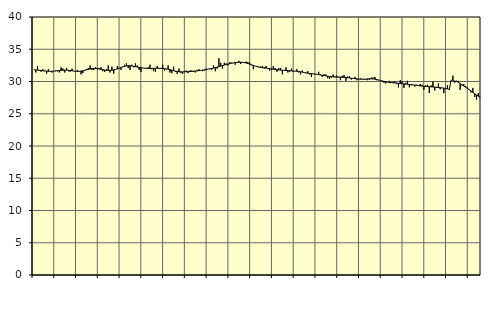
| Category | Piggar | Series 1 |
|---|---|---|
| nan | 31.8 | 31.82 |
| 1.0 | 31.4 | 31.79 |
| 1.0 | 32.4 | 31.76 |
| 1.0 | 31.7 | 31.74 |
| 1.0 | 31.5 | 31.71 |
| 1.0 | 31.9 | 31.68 |
| 1.0 | 31.6 | 31.64 |
| 1.0 | 31.2 | 31.61 |
| 1.0 | 31.9 | 31.59 |
| 1.0 | 31.6 | 31.58 |
| 1.0 | 31.4 | 31.58 |
| 1.0 | 31.6 | 31.6 |
| nan | 31.7 | 31.63 |
| 2.0 | 31.6 | 31.67 |
| 2.0 | 31.4 | 31.7 |
| 2.0 | 32.2 | 31.73 |
| 2.0 | 32 | 31.75 |
| 2.0 | 31.4 | 31.76 |
| 2.0 | 32.1 | 31.76 |
| 2.0 | 31.6 | 31.74 |
| 2.0 | 31.5 | 31.71 |
| 2.0 | 32 | 31.67 |
| 2.0 | 31.6 | 31.62 |
| 2.0 | 31.6 | 31.59 |
| nan | 31.8 | 31.58 |
| 3.0 | 31.6 | 31.58 |
| 3.0 | 31.1 | 31.61 |
| 3.0 | 31.3 | 31.66 |
| 3.0 | 31.7 | 31.73 |
| 3.0 | 31.9 | 31.8 |
| 3.0 | 32.1 | 31.88 |
| 3.0 | 32.5 | 31.95 |
| 3.0 | 31.8 | 32 |
| 3.0 | 31.8 | 32.03 |
| 3.0 | 32.2 | 32.03 |
| 3.0 | 31.9 | 32 |
| nan | 32.1 | 31.95 |
| 4.0 | 32.2 | 31.89 |
| 4.0 | 31.6 | 31.83 |
| 4.0 | 31.5 | 31.78 |
| 4.0 | 31.9 | 31.74 |
| 4.0 | 32.5 | 31.72 |
| 4.0 | 31.4 | 31.72 |
| 4.0 | 32.3 | 31.75 |
| 4.0 | 31.2 | 31.8 |
| 4.0 | 31.8 | 31.87 |
| 4.0 | 32.4 | 31.96 |
| 4.0 | 32 | 32.06 |
| nan | 31.8 | 32.17 |
| 5.0 | 32.3 | 32.27 |
| 5.0 | 32.6 | 32.35 |
| 5.0 | 32.8 | 32.41 |
| 5.0 | 32.1 | 32.45 |
| 5.0 | 31.8 | 32.44 |
| 5.0 | 32.6 | 32.41 |
| 5.0 | 32.2 | 32.36 |
| 5.0 | 32.8 | 32.3 |
| 5.0 | 32.5 | 32.24 |
| 5.0 | 31.8 | 32.19 |
| 5.0 | 31.5 | 32.14 |
| nan | 32.1 | 32.09 |
| 6.0 | 32.1 | 32.06 |
| 6.0 | 32.1 | 32.04 |
| 6.0 | 32.2 | 32.03 |
| 6.0 | 32.6 | 32.02 |
| 6.0 | 31.9 | 32.03 |
| 6.0 | 31.6 | 32.04 |
| 6.0 | 31.5 | 32.05 |
| 6.0 | 32.4 | 32.06 |
| 6.0 | 32 | 32.05 |
| 6.0 | 32.1 | 32.04 |
| 6.0 | 32.6 | 32.03 |
| nan | 31.7 | 32 |
| 7.0 | 31.9 | 31.96 |
| 7.0 | 32.5 | 31.91 |
| 7.0 | 31.4 | 31.84 |
| 7.0 | 31.3 | 31.76 |
| 7.0 | 32.3 | 31.68 |
| 7.0 | 31.5 | 31.61 |
| 7.0 | 31.2 | 31.56 |
| 7.0 | 32 | 31.53 |
| 7.0 | 31.3 | 31.5 |
| 7.0 | 31.2 | 31.49 |
| 7.0 | 31.6 | 31.5 |
| nan | 31.7 | 31.51 |
| 8.0 | 31.3 | 31.52 |
| 8.0 | 31.7 | 31.54 |
| 8.0 | 31.7 | 31.57 |
| 8.0 | 31.5 | 31.6 |
| 8.0 | 31.4 | 31.62 |
| 8.0 | 31.8 | 31.65 |
| 8.0 | 31.9 | 31.68 |
| 8.0 | 31.7 | 31.72 |
| 8.0 | 31.6 | 31.76 |
| 8.0 | 31.7 | 31.81 |
| 8.0 | 32 | 31.86 |
| nan | 31.9 | 31.91 |
| 9.0 | 32 | 31.96 |
| 9.0 | 31.8 | 32.02 |
| 9.0 | 32.5 | 32.08 |
| 9.0 | 31.6 | 32.15 |
| 9.0 | 32 | 32.22 |
| 9.0 | 33.6 | 32.3 |
| 9.0 | 32.9 | 32.38 |
| 9.0 | 32 | 32.47 |
| 9.0 | 32.9 | 32.55 |
| 9.0 | 32.8 | 32.63 |
| 9.0 | 32.5 | 32.71 |
| nan | 33 | 32.77 |
| 10.0 | 32.9 | 32.83 |
| 10.0 | 32.9 | 32.88 |
| 10.0 | 32.6 | 32.93 |
| 10.0 | 33 | 32.96 |
| 10.0 | 33.2 | 32.98 |
| 10.0 | 32.7 | 32.99 |
| 10.0 | 33 | 32.97 |
| 10.0 | 33 | 32.93 |
| 10.0 | 33.1 | 32.87 |
| 10.0 | 33 | 32.78 |
| 10.0 | 32.9 | 32.69 |
| nan | 32.5 | 32.59 |
| 11.0 | 31.9 | 32.49 |
| 11.0 | 32.4 | 32.4 |
| 11.0 | 32.3 | 32.32 |
| 11.0 | 32.2 | 32.26 |
| 11.0 | 32.3 | 32.2 |
| 11.0 | 32.4 | 32.16 |
| 11.0 | 32 | 32.12 |
| 11.0 | 32.4 | 32.08 |
| 11.0 | 32 | 32.04 |
| 11.0 | 31.7 | 32 |
| 11.0 | 31.8 | 31.95 |
| nan | 32.4 | 31.9 |
| 12.0 | 32.1 | 31.86 |
| 12.0 | 31.5 | 31.83 |
| 12.0 | 32.1 | 31.8 |
| 12.0 | 32.1 | 31.77 |
| 12.0 | 31.1 | 31.75 |
| 12.0 | 31.7 | 31.73 |
| 12.0 | 32.2 | 31.71 |
| 12.0 | 31.4 | 31.69 |
| 12.0 | 31.5 | 31.67 |
| 12.0 | 32 | 31.65 |
| 12.0 | 31.5 | 31.63 |
| nan | 31.6 | 31.61 |
| 13.0 | 31.9 | 31.59 |
| 13.0 | 31.4 | 31.55 |
| 13.0 | 31.1 | 31.51 |
| 13.0 | 31.7 | 31.45 |
| 13.0 | 31.4 | 31.4 |
| 13.0 | 31.3 | 31.34 |
| 13.0 | 31.6 | 31.29 |
| 13.0 | 31.1 | 31.25 |
| 13.0 | 30.7 | 31.21 |
| 13.0 | 31.2 | 31.18 |
| 13.0 | 31.1 | 31.15 |
| nan | 31.1 | 31.11 |
| 14.0 | 31.5 | 31.07 |
| 14.0 | 31.1 | 31.02 |
| 14.0 | 30.7 | 30.98 |
| 14.0 | 31.1 | 30.93 |
| 14.0 | 31.1 | 30.88 |
| 14.0 | 30.5 | 30.83 |
| 14.0 | 30.4 | 30.78 |
| 14.0 | 30.6 | 30.74 |
| 14.0 | 31.1 | 30.72 |
| 14.0 | 30.8 | 30.7 |
| 14.0 | 30.9 | 30.7 |
| nan | 30.6 | 30.69 |
| 15.0 | 30.2 | 30.68 |
| 15.0 | 30.9 | 30.66 |
| 15.0 | 31 | 30.64 |
| 15.0 | 30.1 | 30.61 |
| 15.0 | 30.8 | 30.58 |
| 15.0 | 30.8 | 30.55 |
| 15.0 | 30.3 | 30.51 |
| 15.0 | 30.5 | 30.48 |
| 15.0 | 30.7 | 30.45 |
| 15.0 | 30.2 | 30.41 |
| 15.0 | 30.3 | 30.38 |
| nan | 30.5 | 30.36 |
| 16.0 | 30.4 | 30.35 |
| 16.0 | 30.3 | 30.36 |
| 16.0 | 30.3 | 30.38 |
| 16.0 | 30.2 | 30.4 |
| 16.0 | 30.3 | 30.42 |
| 16.0 | 30.6 | 30.41 |
| 16.0 | 30.6 | 30.4 |
| 16.0 | 30.7 | 30.36 |
| 16.0 | 30.2 | 30.3 |
| 16.0 | 30.2 | 30.24 |
| 16.0 | 30.2 | 30.17 |
| nan | 30 | 30.09 |
| 17.0 | 29.8 | 30.02 |
| 17.0 | 29.7 | 29.96 |
| 17.0 | 29.9 | 29.9 |
| 17.0 | 30.1 | 29.86 |
| 17.0 | 29.9 | 29.83 |
| 17.0 | 29.9 | 29.81 |
| 17.0 | 30 | 29.78 |
| 17.0 | 29.6 | 29.76 |
| 17.0 | 29.1 | 29.73 |
| 17.0 | 30.2 | 29.69 |
| 17.0 | 30 | 29.66 |
| nan | 29 | 29.62 |
| 18.0 | 29.8 | 29.59 |
| 18.0 | 30.1 | 29.56 |
| 18.0 | 29.1 | 29.53 |
| 18.0 | 29.4 | 29.51 |
| 18.0 | 29.5 | 29.48 |
| 18.0 | 29.2 | 29.44 |
| 18.0 | 29.5 | 29.41 |
| 18.0 | 29.4 | 29.36 |
| 18.0 | 29.6 | 29.32 |
| 18.0 | 29.5 | 29.29 |
| 18.0 | 28.7 | 29.25 |
| nan | 29.4 | 29.23 |
| 19.0 | 29.5 | 29.21 |
| 19.0 | 28.2 | 29.19 |
| 19.0 | 29.4 | 29.17 |
| 19.0 | 30 | 29.15 |
| 19.0 | 28.6 | 29.13 |
| 19.0 | 29 | 29.1 |
| 19.0 | 29.7 | 29.07 |
| 19.0 | 28.8 | 29.04 |
| 19.0 | 29 | 29.01 |
| 19.0 | 28.2 | 28.97 |
| 19.0 | 28.9 | 28.92 |
| nan | 29.4 | 28.85 |
| 20.0 | 28.7 | 28.76 |
| 20.0 | 30.2 | 30.2 |
| 20.0 | 30.9 | 30.2 |
| 20.0 | 29.8 | 30.05 |
| 20.0 | 30.1 | 30.04 |
| 20.0 | 30.1 | 29.87 |
| 20.0 | 28.7 | 29.69 |
| 20.0 | 29.4 | 29.5 |
| 20.0 | 29.6 | 29.31 |
| 20.0 | 29.3 | 29.12 |
| 20.0 | 29.1 | 28.93 |
| nan | 28.8 | 28.73 |
| 21.0 | 28.3 | 28.53 |
| 21.0 | 29 | 28.32 |
| 21.0 | 27.6 | 28.11 |
| 21.0 | 27.2 | 27.91 |
| 21.0 | 28.2 | 27.72 |
| 21.0 | 27.5 | 27.56 |